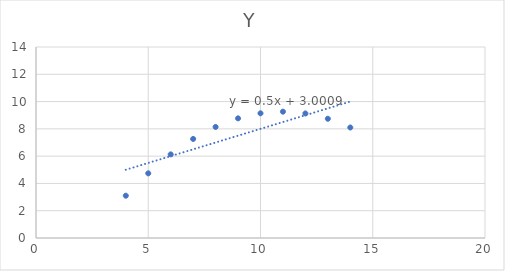
| Category | Y |
|---|---|
| 10.0 | 9.14 |
| 8.0 | 8.14 |
| 13.0 | 8.74 |
| 9.0 | 8.77 |
| 11.0 | 9.26 |
| 14.0 | 8.1 |
| 6.0 | 6.13 |
| 4.0 | 3.1 |
| 12.0 | 9.13 |
| 7.0 | 7.26 |
| 5.0 | 4.74 |